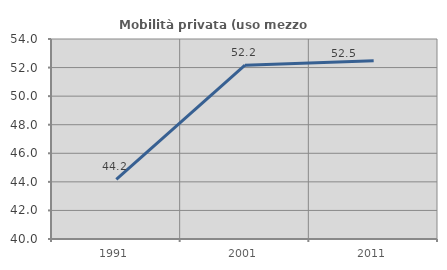
| Category | Mobilità privata (uso mezzo privato) |
|---|---|
| 1991.0 | 44.182 |
| 2001.0 | 52.171 |
| 2011.0 | 52.473 |